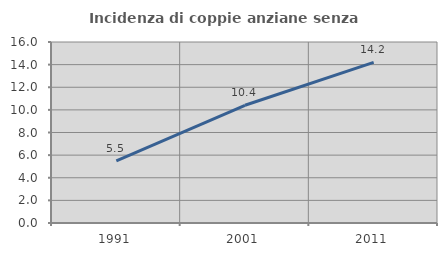
| Category | Incidenza di coppie anziane senza figli  |
|---|---|
| 1991.0 | 5.499 |
| 2001.0 | 10.405 |
| 2011.0 | 14.205 |